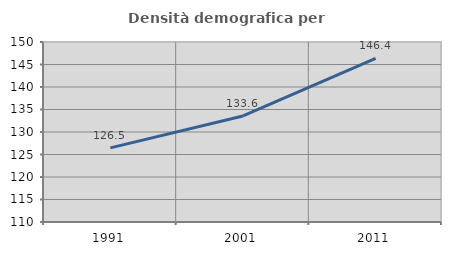
| Category | Densità demografica |
|---|---|
| 1991.0 | 126.465 |
| 2001.0 | 133.572 |
| 2011.0 | 146.354 |